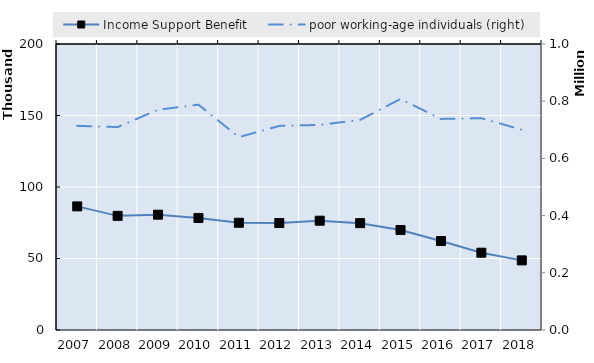
| Category | Income Support Benefit | Series 4 | Series 5 | Series 6 | Series 7 | Series 8 | Series 9 | Series 10 | Series 11 | Series 12 | Series 13 | Series 14 | Series 15 | Series 16 | Series 17 | Series 18 | Series 19 |
|---|---|---|---|---|---|---|---|---|---|---|---|---|---|---|---|---|---|
| 2007.0 | 86436 |  |  |  |  |  |  |  |  |  |  |  |  |  |  |  |  |
| 2008.0 | 79816 |  |  |  |  |  |  |  |  |  |  |  |  |  |  |  |  |
| 2009.0 | 80638 |  |  |  |  |  |  |  |  |  |  |  |  |  |  |  |  |
| 2010.0 | 78352 |  |  |  |  |  |  |  |  |  |  |  |  |  |  |  |  |
| 2011.0 | 74995 |  |  |  |  |  |  |  |  |  |  |  |  |  |  |  |  |
| 2012.0 | 74795 |  |  |  |  |  |  |  |  |  |  |  |  |  |  |  |  |
| 2013.0 | 76442 |  |  |  |  |  |  |  |  |  |  |  |  |  |  |  |  |
| 2014.0 | 74721 |  |  |  |  |  |  |  |  |  |  |  |  |  |  |  |  |
| 2015.0 | 69902 |  |  |  |  |  |  |  |  |  |  |  |  |  |  |  |  |
| 2016.0 | 62223 |  |  |  |  |  |  |  |  |  |  |  |  |  |  |  |  |
| 2017.0 | 54064 |  |  |  |  |  |  |  |  |  |  |  |  |  |  |  |  |
| 2018.0 | 48685 |  |  |  |  |  |  |  |  |  |  |  |  |  |  |  |  |